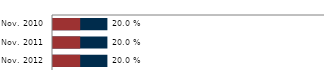
| Category | Global stunting | Severe stunting |
|---|---|---|
| Nov. 2010 | 0.2 | 0.1 |
| Nov. 2011 | 0.2 | 0.1 |
| Nov. 2012 | 0.2 | 0.1 |